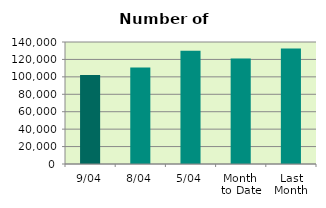
| Category | Series 0 |
|---|---|
| 9/04 | 102008 |
| 8/04 | 110722 |
| 5/04 | 130076 |
| Month 
to Date | 121100 |
| Last
Month | 132498.571 |